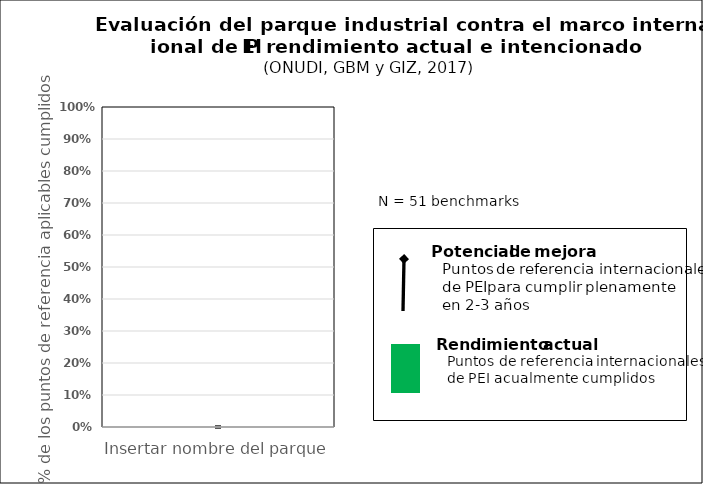
| Category | Desempeño Actual |
|---|---|
| Insertar nombre del parque | 0 |